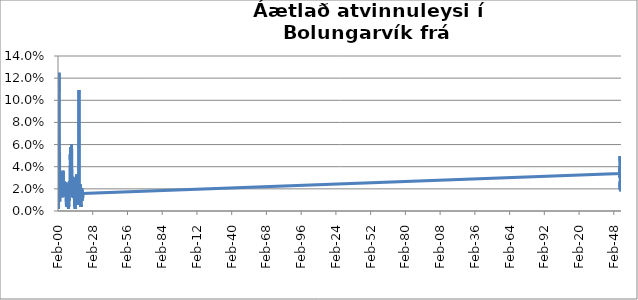
| Category | Series 0 |
|---|---|
| 2000-02-01 | 0.007 |
| 2000-03-01 | 0.009 |
| 2000-04-01 | 0.007 |
| 2000-05-01 | 0.003 |
| 2000-06-01 | 0.003 |
| 2000-07-01 | 0.002 |
| 2000-08-01 | 0.007 |
| 2000-09-01 | 0.012 |
| 2000-10-01 | 0.023 |
| 2000-11-01 | 0.024 |
| 2000-12-01 | 0.125 |
| 2001-01-01 | 0.108 |
| 2001-02-01 | 0.075 |
| 2001-03-01 | 0.054 |
| 2001-04-01 | 0.054 |
| 2001-05-01 | 0.052 |
| 2001-06-01 | 0.021 |
| 2001-07-01 | 0.009 |
| 2001-08-01 | 0.017 |
| 2001-09-01 | 0.017 |
| 2001-10-01 | 0.017 |
| 2001-11-01 | 0.014 |
| 2001-12-01 | 0.014 |
| 2002-01-01 | 0.014 |
| 2002-02-01 | 0.013 |
| 2002-03-01 | 0.014 |
| 2002-04-01 | 0.016 |
| 2002-05-01 | 0.023 |
| 2002-06-01 | 0.016 |
| 2002-07-01 | 0.014 |
| 2002-08-01 | 0.014 |
| 2002-09-01 | 0.018 |
| 2002-10-01 | 0.02 |
| 2002-11-01 | 0.022 |
| 2002-12-01 | 0.031 |
| 2003-01-01 | 0.03 |
| 2003-02-01 | 0.03 |
| 2003-03-01 | 0.025 |
| 2003-04-01 | 0.022 |
| 2003-05-01 | 0.02 |
| 2003-06-01 | 0.02 |
| 2003-07-01 | 0.021 |
| 2003-08-01 | 0.012 |
| 2003-09-01 | 0.028 |
| 2003-10-01 | 0.032 |
| 2003-11-01 | 0.036 |
| 2003-12-01 | 0.028 |
| 2004-01-01 | 0.031 |
| 2004-02-01 | 0.021 |
| 2004-03-01 | 0.036 |
| 2004-04-01 | 0.032 |
| 2004-05-01 | 0.026 |
| 2004-06-01 | 0.034 |
| 2004-07-01 | 0.032 |
| 2004-08-01 | 0.026 |
| 2004-09-01 | 0.021 |
| 2004-10-01 | 0.023 |
| 2004-11-01 | 0.027 |
| 2004-12-01 | 0.017 |
| 2005-01-01 | 0.025 |
| 2005-02-01 | 0.025 |
| 2005-03-01 | 0.019 |
| 2005-04-01 | 0.023 |
| 2005-05-01 | 0.023 |
| 2005-06-01 | 0.015 |
| 2005-07-01 | 0.013 |
| 2005-08-01 | 0.021 |
| 2005-09-01 | 0.022 |
| 2005-10-01 | 0.019 |
| 2005-11-01 | 0.02 |
| 2005-12-01 | 0.018 |
| 2006-01-01 | 0.016 |
| 2006-02-01 | 0.014 |
| 2006-03-01 | 0.018 |
| 2006-04-01 | 0.021 |
| 2006-05-01 | 0.026 |
| 2006-06-01 | 0.019 |
| 2006-07-01 | 0.019 |
| 2006-08-01 | 0.011 |
| 2006-09-01 | 0.007 |
| 2006-10-01 | 0.008 |
| 2006-11-01 | 0.006 |
| 2006-12-01 | 0.006 |
| 2007-01-01 | 0.004 |
| 2007-02-01 | 0.004 |
| 2007-03-01 | 0.012 |
| 2007-04-01 | 0.009 |
| 2007-05-01 | 0.013 |
| 2007-06-01 | 0.008 |
| 2007-07-01 | 0.006 |
| 2007-08-01 | 0.025 |
| 2007-09-01 | 0.017 |
| 2007-10-01 | 0.024 |
| 2007-11-01 | 0.02 |
| 2007-12-01 | 0.014 |
| 2008-01-01 | 0.004 |
| 2008-02-01 | 0.004 |
| 2008-03-01 | 0.012 |
| 2008-04-01 | 0.009 |
| 2008-05-01 | 0.004 |
| 2008-06-01 | 0.004 |
| 2008-07-01 | 0.002 |
| 2008-08-01 | 0.004 |
| 2008-09-01 | 0.006 |
| 2008-10-01 | 0.004 |
| 2008-11-01 | 0.006 |
| 2008-12-01 | 0.009 |
| 2009-01-01 | 0.012 |
| 2009-02-01 | 0.01 |
| 2009-03-01 | 0.019 |
| 2009-04-01 | 0.027 |
| 2009-05-01 | 0.023 |
| 2009-06-01 | 0.018 |
| 2009-07-01 | 0.018 |
| 2009-08-01 | 0.016 |
| 2009-09-01 | 0.023 |
| 2009-10-01 | 0.029 |
| 2009-11-01 | 0.038 |
| 2009-12-01 | 0.047 |
| 2010-01-01 | 0.051 |
| 2010-02-01 | 0.044 |
| 2010-03-01 | 0.046 |
| 2010-04-01 | 0.056 |
| 2010-05-01 | 0.058 |
| 2010-06-01 | 0.044 |
| 2010-07-01 | 0.041 |
| 2010-08-01 | 0.037 |
| 2010-09-01 | 0.035 |
| 2010-10-01 | 0.029 |
| 2010-11-01 | 0.032 |
| 2010-12-01 | 0.06 |
| 2011-01-01 | 0.059 |
| 2011-02-01 | 0.055 |
| 2011-03-01 | 0.053 |
| 2011-04-01 | 0.043 |
| 2011-05-01 | 0.022 |
| 2011-06-01 | 0.02 |
| 2011-07-01 | 0.018 |
| 2011-08-01 | 0.022 |
| 2011-09-01 | 0.014 |
| 2011-10-01 | 0.013 |
| 2011-11-01 | 0.017 |
| 2011-12-01 | 0.027 |
| 2012-01-01 | 0.027 |
| 2012-02-01 | 0.027 |
| 2012-03-01 | 0.031 |
| 2012-04-01 | 0.028 |
| 2012-05-01 | 0.016 |
| 2012-06-01 | 0.012 |
| 2012-07-01 | 0.012 |
| 2012-08-01 | 0.012 |
| 2012-09-01 | 0.019 |
| 2012-10-01 | 0.03 |
| 2012-11-01 | 0.028 |
| 2012-12-01 | 0.026 |
| 2013-01-01 | 0.024 |
| 2013-02-01 | 0.02 |
| 2013-03-01 | 0.018 |
| 2013-04-01 | 0.011 |
| 2013-05-01 | 0.009 |
| 2013-06-01 | 0.006 |
| 2013-07-01 | 0.007 |
| 2013-08-01 | 0.007 |
| 2013-09-01 | 0.004 |
| 2013-10-01 | 0.004 |
| 2013-11-01 | 0.004 |
| 2013-12-01 | 0.002 |
| 2014-01-01 | 0.006 |
| 2014-02-01 | 0.01 |
| 2014-03-01 | 0.014 |
| 2014-04-01 | 0.014 |
| 2014-05-01 | 0.018 |
| 2014-06-01 | 0.016 |
| 2014-07-01 | 0.012 |
| 2014-08-01 | 0.006 |
| 2014-09-01 | 0.012 |
| 2014-10-01 | 0.016 |
| 2014-11-01 | 0.02 |
| 2014-12-01 | 0.021 |
| 2015-01-01 | 0.025 |
| 2015-02-01 | 0.033 |
| 2015-03-01 | 0.033 |
| 2015-04-01 | 0.032 |
| 2015-05-01 | 0.026 |
| 2015-06-01 | 0.023 |
| 2015-07-01 | 0.019 |
| 2015-08-01 | 0.017 |
| 2015-09-01 | 0.011 |
| 2015-10-01 | 0.012 |
| 2015-11-01 | 0.01 |
| 2015-12-01 | 0.012 |
| 2016-01-01 | 0.012 |
| 2016-02-01 | 0.017 |
| 2016-03-01 | 0.019 |
| 2016-04-01 | 0.023 |
| 2016-05-01 | 0.027 |
| 2016-06-01 | 0.013 |
| 2016-07-01 | 0.011 |
| 2016-08-01 | 0.007 |
| 2016-09-01 | 0.009 |
| 2016-10-01 | 0.006 |
| 2016-11-01 | 0.023 |
| 2016-12-01 | 0.096 |
| 2017-01-01 | 0.109 |
| 2017-02-01 | 0.023 |
| 2017-03-01 | 0.017 |
| 2017-04-01 | 0.015 |
| 2017-05-01 | 0.009 |
| 2017-06-01 | 0.009 |
| 2017-07-01 | 0.007 |
| 2017-08-01 | 0.02 |
| 2017-09-01 | 0.016 |
| 2017-10-01 | 0.017 |
| 2017-11-01 | 0.017 |
| 2017-12-01 | 0.015 |
| 2018-01-01 | 0.019 |
| 2018-02-01 | 0.024 |
| 2018-03-01 | 0.024 |
| 2018-04-01 | 0.018 |
| 2018-05-01 | 0.011 |
| 2018-06-01 | 0.007 |
| 2018-07-01 | 0.004 |
| 2018-08-01 | 0.006 |
| 2018-09-01 | 0.004 |
| 2018-10-01 | 0.013 |
| 2018-11-01 | 0.013 |
| 2018-12-01 | 0.013 |
| 2019-01-01 | 0.013 |
| 2019-02-01 | 0.019 |
| 2019-03-01 | 0.017 |
| 2019-04-01 | 0.02 |
| 2019-05-01 | 0.015 |
| 2019-06-01 | 0.013 |
| 2019-07-01 | 0.013 |
| 2019-08-01 | 0.009 |
| 2019-09-01 | 0.013 |
| 2019-10-01 | 0.013 |
| 2019-11-01 | 0.019 |
| 2019-12-01 | 0.013 |
| 2020-01-01 | 0.012 |
| 2020-02-01 | 0.016 |
| 202003.0 | 0.034 |
| 202004.0 | 0.04 |
| 202005.0 | 0.03 |
| 202006.0 | 0.04 |
| 202007.0 | 0.036 |
| 202008.0 | 0.038 |
| 202009.0 | 0.04 |
| 202010.0 | 0.044 |
| 202011.0 | 0.05 |
| 202012.0 | 0.046 |
| 202101.0 | 0.043 |
| 202102.0 | 0.039 |
| 202103.0 | 0.039 |
| 202104.0 | 0.038 |
| 202105.0 | 0.028 |
| 202106.0 | 0.028 |
| 202107.0 | 0.025 |
| 202108.0 | 0.027 |
| 202109.0 | 0.019 |
| 202110.0 | 0.025 |
| 202111.0 | 0.021 |
| 202112.0 | 0.023 |
| 202201.0 | 0.027 |
| 202202.0 | 0.025 |
| 202203.0 | 0.023 |
| 202204.0 | 0.018 |
| 202205.0 | 0.022 |
| 202206.0 | 0.022 |
| 202207.0 | 0.023 |
| 202208.0 | 0.023 |
| 202209.0 | 0.018 |
| 202210.0 | 0.023 |
| 202211.0 | 0.025 |
| 202212.0 | 0.025 |
| 202301.0 | 0.025 |
| 202302.0 | 0.023 |
| 202303.0 | 0.025 |
| 202304.0 | 0.026 |